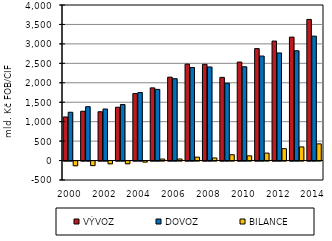
| Category | VÝVOZ | DOVOZ | BILANCE |
|---|---|---|---|
| 2000.0 | 1121.099 | 1241.924 | -120.825 |
| 2001.0 | 1268.149 | 1385.564 | -117.415 |
| 2002.0 | 1254.86 | 1325.671 | -70.811 |
| 2003.0 | 1370.93 | 1440.723 | -69.793 |
| 2004.0 | 1722.657 | 1749.095 | -26.438 |
| 2005.0 | 1868.586 | 1829.962 | 38.624 |
| 2006.0 | 2144.573 | 2104.812 | 39.761 |
| 2007.0 | 2479.234 | 2391.319 | 87.915 |
| 2008.0 | 2473.736 | 2406.489 | 67.246 |
| 2009.0 | 2138.623 | 1989.036 | 149.587 |
| 2010.0 | 2532.797 | 2411.556 | 121.241 |
| 2011.0 | 2878.691 | 2687.563 | 191.128 |
| 2012.0 | 3072.598 | 2766.888 | 305.71 |
| 2013.0 | 3174.704 | 2823.485 | 351.22 |
| 2014.0 | 3628.826 | 3199.63 | 429.195 |